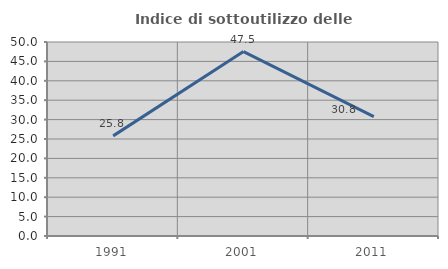
| Category | Indice di sottoutilizzo delle abitazioni  |
|---|---|
| 1991.0 | 25.806 |
| 2001.0 | 47.541 |
| 2011.0 | 30.769 |